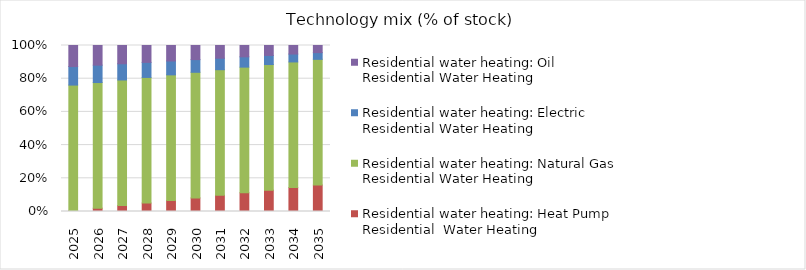
| Category | Residential water heating: Heat Pump Residential  Water Heating | Residential water heating: Natural Gas Residential Water Heating | Residential water heating: Electric Residential Water Heating | Residential water heating: Oil Residential Water Heating |
|---|---|---|---|---|
| 2025.0 | 0.005 | 0.757 | 0.112 | 0.127 |
| 2026.0 | 0.02 | 0.757 | 0.105 | 0.118 |
| 2027.0 | 0.035 | 0.757 | 0.098 | 0.11 |
| 2028.0 | 0.051 | 0.757 | 0.091 | 0.102 |
| 2029.0 | 0.066 | 0.757 | 0.084 | 0.093 |
| 2030.0 | 0.082 | 0.757 | 0.076 | 0.085 |
| 2031.0 | 0.097 | 0.757 | 0.069 | 0.077 |
| 2032.0 | 0.113 | 0.757 | 0.062 | 0.068 |
| 2033.0 | 0.128 | 0.757 | 0.055 | 0.06 |
| 2034.0 | 0.144 | 0.757 | 0.048 | 0.051 |
| 2035.0 | 0.16 | 0.757 | 0.04 | 0.043 |